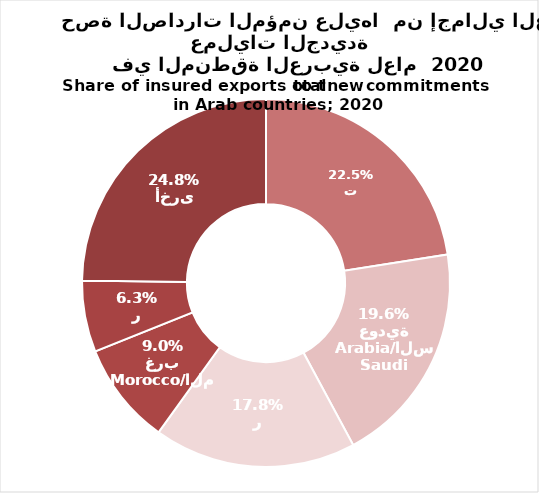
| Category | Series 0 |
|---|---|
| UAE/الامارات | 0.225 |
| Saudi Arabia/السعودية | 0.196 |
| Egypt/مصر | 0.178 |
| Morocco/المغرب | 0.09 |
| Qatar/قطر | 0.063 |
| Others/ أخرى | 0.248 |